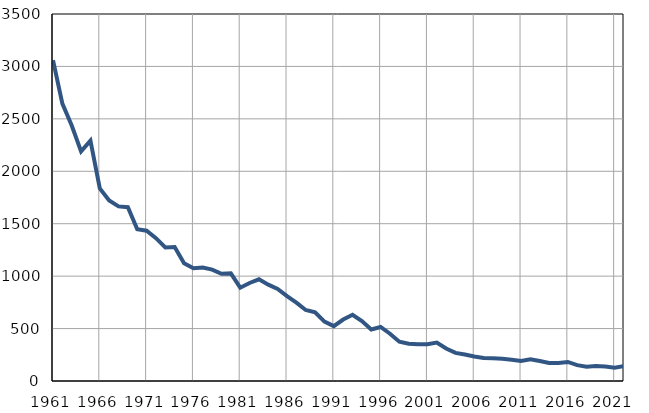
| Category | Infants
deaths |
|---|---|
| 1961.0 | 3059 |
| 1962.0 | 2645 |
| 1963.0 | 2437 |
| 1964.0 | 2190 |
| 1965.0 | 2292 |
| 1966.0 | 1837 |
| 1967.0 | 1721 |
| 1968.0 | 1665 |
| 1969.0 | 1658 |
| 1970.0 | 1447 |
| 1971.0 | 1433 |
| 1972.0 | 1362 |
| 1973.0 | 1274 |
| 1974.0 | 1278 |
| 1975.0 | 1124 |
| 1976.0 | 1075 |
| 1977.0 | 1082 |
| 1978.0 | 1062 |
| 1979.0 | 1022 |
| 1980.0 | 1026 |
| 1981.0 | 890 |
| 1982.0 | 935 |
| 1983.0 | 970 |
| 1984.0 | 919 |
| 1985.0 | 878 |
| 1986.0 | 809 |
| 1987.0 | 747 |
| 1988.0 | 677 |
| 1989.0 | 654 |
| 1990.0 | 566 |
| 1991.0 | 523 |
| 1992.0 | 586 |
| 1993.0 | 632 |
| 1994.0 | 571 |
| 1995.0 | 491 |
| 1996.0 | 515 |
| 1997.0 | 451 |
| 1998.0 | 375 |
| 1999.0 | 356 |
| 2000.0 | 351 |
| 2001.0 | 351 |
| 2002.0 | 367 |
| 2003.0 | 310 |
| 2004.0 | 268 |
| 2005.0 | 252 |
| 2006.0 | 233 |
| 2007.0 | 219 |
| 2008.0 | 218 |
| 2009.0 | 213 |
| 2010.0 | 202 |
| 2011.0 | 191 |
| 2012.0 | 207 |
| 2013.0 | 190 |
| 2014.0 | 172 |
| 2015.0 | 172 |
| 2016.0 | 182 |
| 2017.0 | 151 |
| 2018.0 | 137 |
| 2019.0 | 143 |
| 2020.0 | 138 |
| 2021.0 | 126 |
| 2022.0 | 143 |